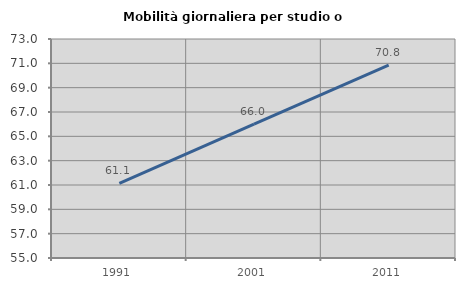
| Category | Mobilità giornaliera per studio o lavoro |
|---|---|
| 1991.0 | 61.139 |
| 2001.0 | 66.007 |
| 2011.0 | 70.844 |